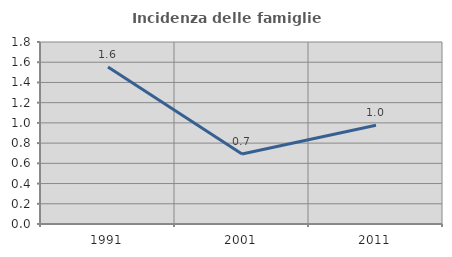
| Category | Incidenza delle famiglie numerose |
|---|---|
| 1991.0 | 1.552 |
| 2001.0 | 0.692 |
| 2011.0 | 0.977 |